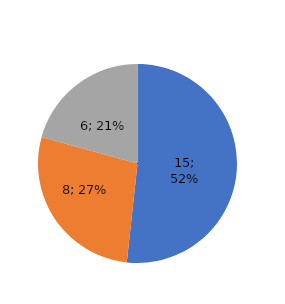
| Category | SR Nevršno |
|---|---|
| Neobezbjeđeno | 15 |
| EP BiH | 8 |
| ERS | 6 |
| EP HZHB | 0 |